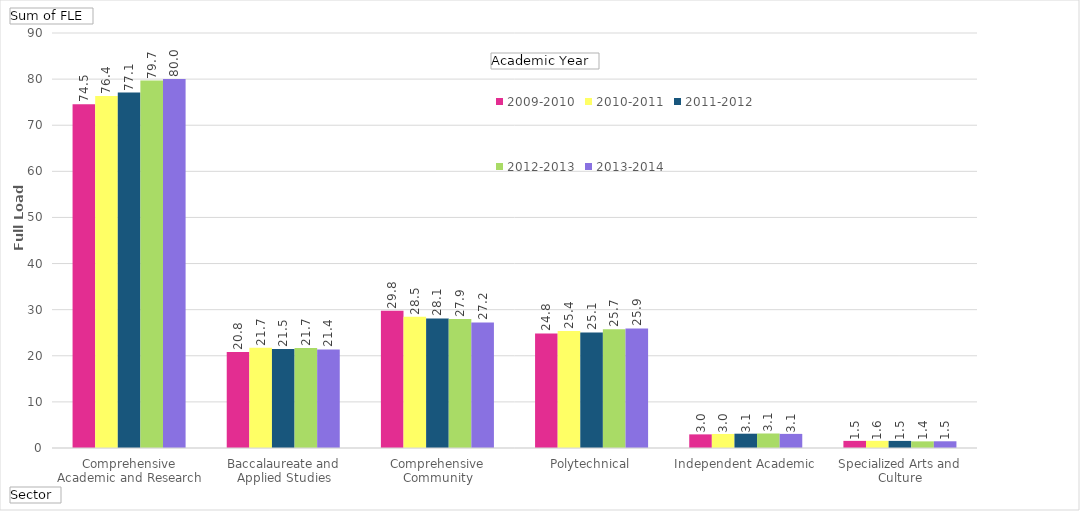
| Category | 2009-2010 | 2010-2011 | 2011-2012 | 2012-2013 | 2013-2014 |
|---|---|---|---|---|---|
| Comprehensive Academic and Research | 74523.313 | 76354.828 | 77079.012 | 79674.258 | 80044.13 |
| Baccalaureate and Applied Studies | 20827.264 | 21736.539 | 21495.251 | 21675.563 | 21377.156 |
| Comprehensive Community | 29781.253 | 28483.043 | 28094.756 | 27949.983 | 27225.046 |
| Polytechnical | 24831.434 | 25354.261 | 25064.888 | 25740.281 | 25941.005 |
| Independent Academic | 2954.144 | 3043.254 | 3102.746 | 3146.174 | 3060.324 |
| Specialized Arts and Culture | 1544.52 | 1556.02 | 1539.25 | 1437.74 | 1457.12 |